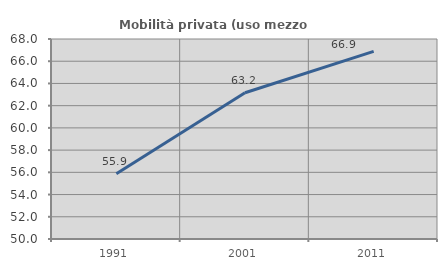
| Category | Mobilità privata (uso mezzo privato) |
|---|---|
| 1991.0 | 55.868 |
| 2001.0 | 63.158 |
| 2011.0 | 66.888 |